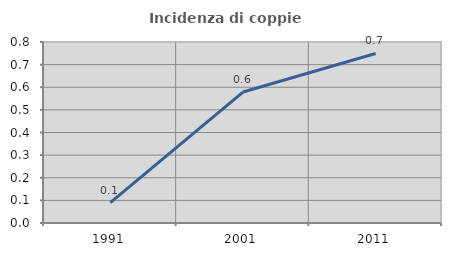
| Category | Incidenza di coppie miste |
|---|---|
| 1991.0 | 0.09 |
| 2001.0 | 0.579 |
| 2011.0 | 0.749 |